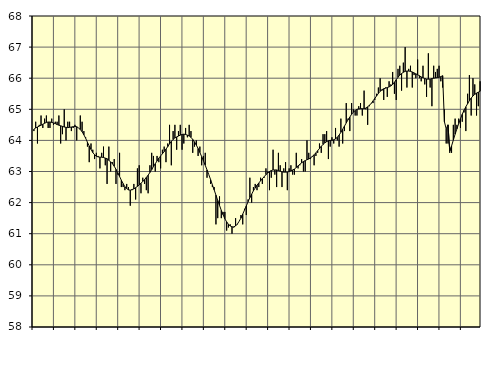
| Category | Piggar | Series 1 |
|---|---|---|
| nan | 64.3 | 64.36 |
| 1.0 | 64.6 | 64.4 |
| 1.0 | 63.9 | 64.43 |
| 1.0 | 64.5 | 64.46 |
| 1.0 | 64.8 | 64.49 |
| 1.0 | 64.4 | 64.52 |
| 1.0 | 64.7 | 64.55 |
| 1.0 | 64.8 | 64.58 |
| 1.0 | 64.4 | 64.59 |
| 1.0 | 64.4 | 64.59 |
| 1.0 | 64.7 | 64.58 |
| 1.0 | 64.5 | 64.56 |
| nan | 64.6 | 64.54 |
| 2.0 | 64.6 | 64.51 |
| 2.0 | 64.8 | 64.49 |
| 2.0 | 63.9 | 64.47 |
| 2.0 | 64.2 | 64.45 |
| 2.0 | 65 | 64.43 |
| 2.0 | 64 | 64.42 |
| 2.0 | 64.6 | 64.41 |
| 2.0 | 64.6 | 64.42 |
| 2.0 | 64.3 | 64.43 |
| 2.0 | 64.4 | 64.44 |
| 2.0 | 64.5 | 64.45 |
| nan | 64 | 64.44 |
| 3.0 | 64.4 | 64.4 |
| 3.0 | 64.8 | 64.35 |
| 3.0 | 64.6 | 64.28 |
| 3.0 | 64.3 | 64.18 |
| 3.0 | 64.1 | 64.07 |
| 3.0 | 63.8 | 63.94 |
| 3.0 | 63.3 | 63.82 |
| 3.0 | 63.9 | 63.71 |
| 3.0 | 63.7 | 63.61 |
| 3.0 | 63.4 | 63.54 |
| 3.0 | 63.6 | 63.49 |
| nan | 63.5 | 63.47 |
| 4.0 | 63.1 | 63.46 |
| 4.0 | 63.6 | 63.46 |
| 4.0 | 63.8 | 63.45 |
| 4.0 | 63.2 | 63.43 |
| 4.0 | 62.6 | 63.41 |
| 4.0 | 63.8 | 63.36 |
| 4.0 | 63 | 63.31 |
| 4.0 | 63.3 | 63.25 |
| 4.0 | 63.4 | 63.17 |
| 4.0 | 62.6 | 63.07 |
| 4.0 | 62.9 | 62.96 |
| nan | 63.6 | 62.84 |
| 5.0 | 62.5 | 62.72 |
| 5.0 | 62.5 | 62.61 |
| 5.0 | 62.4 | 62.51 |
| 5.0 | 62.6 | 62.45 |
| 5.0 | 62.5 | 62.41 |
| 5.0 | 61.9 | 62.4 |
| 5.0 | 62.4 | 62.42 |
| 5.0 | 62.6 | 62.44 |
| 5.0 | 62.1 | 62.48 |
| 5.0 | 63.1 | 62.52 |
| 5.0 | 63.2 | 62.57 |
| nan | 62.3 | 62.62 |
| 6.0 | 62.8 | 62.68 |
| 6.0 | 62.6 | 62.74 |
| 6.0 | 62.4 | 62.81 |
| 6.0 | 62.3 | 62.88 |
| 6.0 | 63.2 | 62.97 |
| 6.0 | 63.6 | 63.06 |
| 6.0 | 63.5 | 63.16 |
| 6.0 | 63 | 63.25 |
| 6.0 | 63.5 | 63.34 |
| 6.0 | 63.3 | 63.43 |
| 6.0 | 63.1 | 63.5 |
| nan | 63.7 | 63.57 |
| 7.0 | 63.8 | 63.64 |
| 7.0 | 63.3 | 63.72 |
| 7.0 | 63.9 | 63.8 |
| 7.0 | 64.5 | 63.89 |
| 7.0 | 63.2 | 63.97 |
| 7.0 | 64.3 | 64.03 |
| 7.0 | 64.5 | 64.08 |
| 7.0 | 63.7 | 64.11 |
| 7.0 | 64.3 | 64.14 |
| 7.0 | 64.5 | 64.17 |
| 7.0 | 63.7 | 64.19 |
| nan | 63.9 | 64.2 |
| 8.0 | 64.4 | 64.19 |
| 8.0 | 64.1 | 64.17 |
| 8.0 | 64.5 | 64.14 |
| 8.0 | 64.3 | 64.1 |
| 8.0 | 63.6 | 64.03 |
| 8.0 | 63.8 | 63.95 |
| 8.0 | 64 | 63.85 |
| 8.0 | 63.5 | 63.74 |
| 8.0 | 63.8 | 63.61 |
| 8.0 | 63.2 | 63.48 |
| 8.0 | 63.5 | 63.34 |
| nan | 63.6 | 63.2 |
| 9.0 | 62.8 | 63.05 |
| 9.0 | 62.9 | 62.9 |
| 9.0 | 62.6 | 62.74 |
| 9.0 | 62.5 | 62.57 |
| 9.0 | 62.5 | 62.41 |
| 9.0 | 61.3 | 62.24 |
| 9.0 | 61.5 | 62.07 |
| 9.0 | 62.2 | 61.91 |
| 9.0 | 61.5 | 61.75 |
| 9.0 | 61.7 | 61.61 |
| 9.0 | 61.7 | 61.48 |
| nan | 61.1 | 61.38 |
| 10.0 | 61.2 | 61.3 |
| 10.0 | 61.3 | 61.25 |
| 10.0 | 61 | 61.22 |
| 10.0 | 61.2 | 61.22 |
| 10.0 | 61.5 | 61.25 |
| 10.0 | 61.3 | 61.31 |
| 10.0 | 61.4 | 61.4 |
| 10.0 | 61.6 | 61.5 |
| 10.0 | 61.3 | 61.63 |
| 10.0 | 61.8 | 61.76 |
| 10.0 | 61.6 | 61.89 |
| nan | 62.1 | 62.03 |
| 11.0 | 62.8 | 62.16 |
| 11.0 | 62 | 62.27 |
| 11.0 | 62.5 | 62.38 |
| 11.0 | 62.6 | 62.47 |
| 11.0 | 62.4 | 62.56 |
| 11.0 | 62.5 | 62.63 |
| 11.0 | 62.8 | 62.7 |
| 11.0 | 62.6 | 62.77 |
| 11.0 | 62.8 | 62.83 |
| 11.0 | 63.1 | 62.9 |
| 11.0 | 63 | 62.95 |
| nan | 62.4 | 63 |
| 12.0 | 62.8 | 63.03 |
| 12.0 | 63.7 | 63.05 |
| 12.0 | 62.9 | 63.05 |
| 12.0 | 62.5 | 63.05 |
| 12.0 | 63.6 | 63.03 |
| 12.0 | 63.2 | 63.01 |
| 12.0 | 62.5 | 62.99 |
| 12.0 | 63.1 | 62.98 |
| 12.0 | 63.3 | 62.98 |
| 12.0 | 62.4 | 62.98 |
| 12.0 | 63.1 | 63 |
| nan | 63.2 | 63.02 |
| 13.0 | 62.9 | 63.05 |
| 13.0 | 62.9 | 63.08 |
| 13.0 | 63.6 | 63.13 |
| 13.0 | 63.1 | 63.18 |
| 13.0 | 63.2 | 63.23 |
| 13.0 | 63.4 | 63.28 |
| 13.0 | 63 | 63.32 |
| 13.0 | 63 | 63.35 |
| 13.0 | 64 | 63.38 |
| 13.0 | 63.6 | 63.4 |
| 13.0 | 63.4 | 63.44 |
| nan | 63.5 | 63.48 |
| 14.0 | 63.2 | 63.54 |
| 14.0 | 63.5 | 63.6 |
| 14.0 | 63.6 | 63.67 |
| 14.0 | 63.9 | 63.74 |
| 14.0 | 63.6 | 63.81 |
| 14.0 | 64.2 | 63.87 |
| 14.0 | 64.2 | 63.92 |
| 14.0 | 64.3 | 63.96 |
| 14.0 | 63.4 | 63.99 |
| 14.0 | 63.8 | 64 |
| 14.0 | 64.1 | 64 |
| nan | 63.9 | 64.02 |
| 15.0 | 64.4 | 64.05 |
| 15.0 | 64 | 64.1 |
| 15.0 | 63.8 | 64.17 |
| 15.0 | 64.7 | 64.26 |
| 15.0 | 63.9 | 64.36 |
| 15.0 | 64.3 | 64.46 |
| 15.0 | 65.2 | 64.56 |
| 15.0 | 64.7 | 64.66 |
| 15.0 | 64.3 | 64.75 |
| 15.0 | 65.2 | 64.84 |
| 15.0 | 65 | 64.91 |
| nan | 64.8 | 64.96 |
| 16.0 | 64.8 | 65 |
| 16.0 | 65.1 | 65.01 |
| 16.0 | 65.2 | 65.02 |
| 16.0 | 64.8 | 65.02 |
| 16.0 | 65.6 | 65.02 |
| 16.0 | 65 | 65.04 |
| 16.0 | 64.5 | 65.08 |
| 16.0 | 65.1 | 65.13 |
| 16.0 | 65.2 | 65.19 |
| 16.0 | 65.2 | 65.27 |
| 16.0 | 65.3 | 65.35 |
| nan | 65.5 | 65.43 |
| 17.0 | 65.7 | 65.51 |
| 17.0 | 66 | 65.58 |
| 17.0 | 65.6 | 65.63 |
| 17.0 | 65.3 | 65.66 |
| 17.0 | 65.7 | 65.68 |
| 17.0 | 65.4 | 65.7 |
| 17.0 | 65.9 | 65.72 |
| 17.0 | 65.8 | 65.75 |
| 17.0 | 66.2 | 65.8 |
| 17.0 | 65.5 | 65.87 |
| 17.0 | 65.3 | 65.95 |
| nan | 66.3 | 66.03 |
| 18.0 | 66.4 | 66.1 |
| 18.0 | 65.6 | 66.15 |
| 18.0 | 66.5 | 66.19 |
| 18.0 | 67 | 66.22 |
| 18.0 | 65.7 | 66.23 |
| 18.0 | 66.3 | 66.23 |
| 18.0 | 66.4 | 66.22 |
| 18.0 | 65.7 | 66.2 |
| 18.0 | 66.1 | 66.17 |
| 18.0 | 66 | 66.14 |
| 18.0 | 66.6 | 66.11 |
| nan | 66 | 66.08 |
| 19.0 | 65.9 | 66.04 |
| 19.0 | 66.4 | 66.02 |
| 19.0 | 65.8 | 65.99 |
| 19.0 | 65.4 | 65.97 |
| 19.0 | 66.8 | 65.97 |
| 19.0 | 65.7 | 65.97 |
| 19.0 | 65.1 | 65.99 |
| 19.0 | 66.4 | 66 |
| 19.0 | 66.2 | 66.01 |
| 19.0 | 66.3 | 66.02 |
| 19.0 | 66.4 | 66.03 |
| nan | 65.9 | 66.05 |
| 20.0 | 65.7 | 66.08 |
| 20.0 | 65 | 64.6 |
| 20.0 | 63.9 | 64.37 |
| 20.0 | 63.9 | 64.5 |
| 20.0 | 63.6 | 63.65 |
| 20.0 | 63.6 | 63.82 |
| 20.0 | 64.5 | 64.01 |
| 20.0 | 64.7 | 64.2 |
| 20.0 | 64.5 | 64.37 |
| 20.0 | 64.7 | 64.54 |
| 20.0 | 64.4 | 64.7 |
| nan | 64.6 | 64.84 |
| 21.0 | 64.9 | 64.97 |
| 21.0 | 64.3 | 65.08 |
| 21.0 | 65.5 | 65.18 |
| 21.0 | 66.1 | 65.28 |
| 21.0 | 64.8 | 65.36 |
| 21.0 | 66 | 65.43 |
| 21.0 | 65.8 | 65.48 |
| 21.0 | 64.8 | 65.52 |
| 21.0 | 65.1 | 65.55 |
| 21.0 | 65.9 | 65.58 |